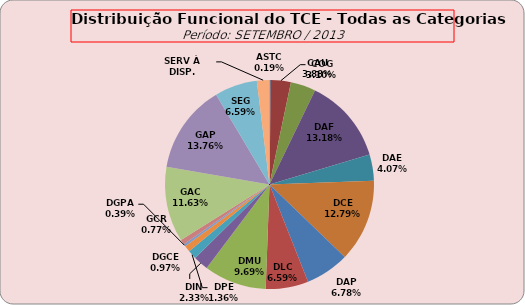
| Category | ASTC COG CAU DAF DAE DCE DAP DLC DMU DIN DPE DGCE DGPA GCR GAC GAP SEG SERV À DISP. |
|---|---|
| ASTC | 1 |
| COG | 16 |
| CAU | 20 |
| DAF | 68 |
| DAE | 21 |
| DCE | 66 |
| DAP | 35 |
| DLC | 34 |
| DMU | 50 |
| DIN | 12 |
| DPE | 7 |
| DGCE | 5 |
| DGPA | 2 |
| GCR | 4 |
| GAC | 60 |
| GAP | 71 |
| SEG | 34 |
| SERV À DISP. | 10 |